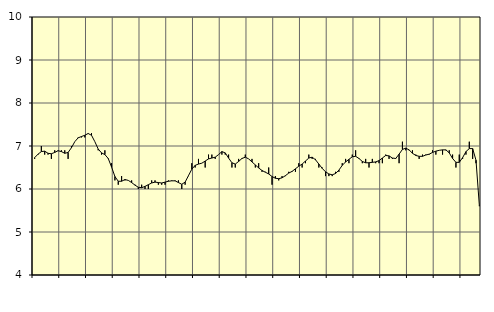
| Category | Piggar | Transport, SNI 49-53 |
|---|---|---|
| nan | 6.7 | 6.73 |
| 87.0 | 6.8 | 6.81 |
| 87.0 | 7 | 6.87 |
| 87.0 | 6.8 | 6.88 |
| nan | 6.8 | 6.83 |
| 88.0 | 6.7 | 6.82 |
| 88.0 | 6.9 | 6.85 |
| 88.0 | 6.9 | 6.89 |
| nan | 6.9 | 6.87 |
| 89.0 | 6.9 | 6.83 |
| 89.0 | 6.7 | 6.85 |
| 89.0 | 7 | 6.96 |
| nan | 7.1 | 7.1 |
| 90.0 | 7.2 | 7.19 |
| 90.0 | 7.2 | 7.22 |
| 90.0 | 7.2 | 7.25 |
| nan | 7.3 | 7.29 |
| 91.0 | 7.3 | 7.25 |
| 91.0 | 7.1 | 7.1 |
| 91.0 | 6.9 | 6.93 |
| nan | 6.8 | 6.84 |
| 92.0 | 6.9 | 6.8 |
| 92.0 | 6.7 | 6.71 |
| 92.0 | 6.6 | 6.51 |
| nan | 6.2 | 6.29 |
| 93.0 | 6.1 | 6.18 |
| 93.0 | 6.3 | 6.18 |
| 93.0 | 6.2 | 6.22 |
| nan | 6.2 | 6.2 |
| 94.0 | 6.2 | 6.15 |
| 94.0 | 6.1 | 6.09 |
| 94.0 | 6 | 6.04 |
| nan | 6.1 | 6.03 |
| 95.0 | 6 | 6.06 |
| 95.0 | 6 | 6.1 |
| 95.0 | 6.2 | 6.14 |
| nan | 6.2 | 6.16 |
| 96.0 | 6.1 | 6.15 |
| 96.0 | 6.1 | 6.14 |
| 96.0 | 6.1 | 6.16 |
| nan | 6.2 | 6.18 |
| 97.0 | 6.2 | 6.19 |
| 97.0 | 6.2 | 6.19 |
| 97.0 | 6.2 | 6.15 |
| nan | 6 | 6.11 |
| 98.0 | 6.1 | 6.16 |
| 98.0 | 6.3 | 6.31 |
| 98.0 | 6.6 | 6.46 |
| nan | 6.5 | 6.55 |
| 99.0 | 6.7 | 6.58 |
| 99.0 | 6.6 | 6.6 |
| 99.0 | 6.5 | 6.65 |
| nan | 6.8 | 6.7 |
| 0.0 | 6.8 | 6.72 |
| 0.0 | 6.7 | 6.74 |
| 0.0 | 6.8 | 6.8 |
| nan | 6.8 | 6.87 |
| 1.0 | 6.8 | 6.84 |
| 1.0 | 6.8 | 6.72 |
| 1.0 | 6.5 | 6.61 |
| nan | 6.5 | 6.58 |
| 2.0 | 6.7 | 6.64 |
| 2.0 | 6.7 | 6.71 |
| 2.0 | 6.8 | 6.74 |
| nan | 6.7 | 6.7 |
| 3.0 | 6.7 | 6.63 |
| 3.0 | 6.5 | 6.56 |
| 3.0 | 6.6 | 6.49 |
| nan | 6.4 | 6.43 |
| 4.0 | 6.4 | 6.39 |
| 4.0 | 6.5 | 6.35 |
| 4.0 | 6.1 | 6.29 |
| nan | 6.3 | 6.25 |
| 5.0 | 6.2 | 6.24 |
| 5.0 | 6.3 | 6.26 |
| 5.0 | 6.3 | 6.31 |
| nan | 6.4 | 6.37 |
| 6.0 | 6.4 | 6.41 |
| 6.0 | 6.4 | 6.47 |
| 6.0 | 6.6 | 6.53 |
| nan | 6.5 | 6.58 |
| 7.0 | 6.6 | 6.65 |
| 7.0 | 6.8 | 6.72 |
| 7.0 | 6.7 | 6.74 |
| nan | 6.7 | 6.68 |
| 8.0 | 6.5 | 6.58 |
| 8.0 | 6.5 | 6.48 |
| 8.0 | 6.3 | 6.4 |
| nan | 6.3 | 6.35 |
| 9.0 | 6.3 | 6.33 |
| 9.0 | 6.4 | 6.36 |
| 9.0 | 6.4 | 6.44 |
| nan | 6.6 | 6.55 |
| 10.0 | 6.7 | 6.63 |
| 10.0 | 6.6 | 6.69 |
| 10.0 | 6.8 | 6.75 |
| nan | 6.9 | 6.76 |
| 11.0 | 6.7 | 6.71 |
| 11.0 | 6.6 | 6.64 |
| 11.0 | 6.7 | 6.61 |
| nan | 6.5 | 6.61 |
| 12.0 | 6.7 | 6.62 |
| 12.0 | 6.6 | 6.63 |
| 12.0 | 6.6 | 6.66 |
| nan | 6.6 | 6.72 |
| 13.0 | 6.8 | 6.78 |
| 13.0 | 6.7 | 6.77 |
| 13.0 | 6.7 | 6.72 |
| nan | 6.7 | 6.71 |
| 14.0 | 6.6 | 6.81 |
| 14.0 | 7.1 | 6.92 |
| 14.0 | 6.9 | 6.95 |
| nan | 6.9 | 6.91 |
| 15.0 | 6.9 | 6.83 |
| 15.0 | 6.8 | 6.78 |
| 15.0 | 6.7 | 6.76 |
| nan | 6.8 | 6.76 |
| 16.0 | 6.8 | 6.79 |
| 16.0 | 6.8 | 6.81 |
| 16.0 | 6.9 | 6.85 |
| nan | 6.8 | 6.88 |
| 17.0 | 6.9 | 6.9 |
| 17.0 | 6.8 | 6.91 |
| 17.0 | 6.9 | 6.91 |
| nan | 6.9 | 6.84 |
| 18.0 | 6.8 | 6.71 |
| 18.0 | 6.5 | 6.62 |
| 18.0 | 6.8 | 6.62 |
| nan | 6.7 | 6.73 |
| 19.0 | 6.8 | 6.87 |
| 19.0 | 7.1 | 6.94 |
| 19.0 | 6.7 | 6.94 |
| nan | 6.6 | 6.67 |
| 20.0 | 5.6 | 5.62 |